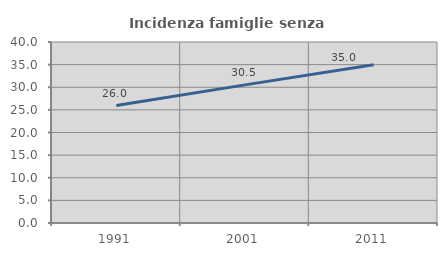
| Category | Incidenza famiglie senza nuclei |
|---|---|
| 1991.0 | 25.952 |
| 2001.0 | 30.526 |
| 2011.0 | 34.951 |